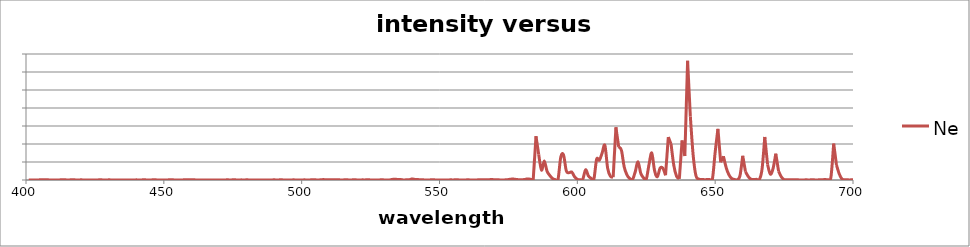
| Category | Ne |
|---|---|
| 401.0 | 1.15 |
| 402.0 | 0 |
| 403.0 | 0 |
| 404.0 | 1.69 |
| 405.0 | 4.13 |
| 406.0 | 9.29 |
| 407.0 | 3.67 |
| 408.0 | 4.07 |
| 409.0 | 1.04 |
| 410.0 | 2.28 |
| 411.0 | 0 |
| 412.0 | 2.03 |
| 413.0 | 7.51 |
| 414.0 | 5.48 |
| 415.0 | 2.01 |
| 416.0 | 3.68 |
| 417.0 | 7.18 |
| 418.0 | 2.76 |
| 419.0 | 0 |
| 420.0 | 5.3 |
| 421.0 | 0 |
| 422.0 | 0 |
| 423.0 | 0.82 |
| 424.0 | 0 |
| 425.0 | 2.9 |
| 426.0 | 2.09 |
| 427.0 | 7.79 |
| 428.0 | 1.15 |
| 429.0 | 0.29 |
| 430.0 | 3.97 |
| 431.0 | 2.51 |
| 432.0 | 1.42 |
| 433.0 | 0 |
| 434.0 | 2.34 |
| 435.0 | 0.03 |
| 436.0 | 0 |
| 437.0 | 0.29 |
| 438.0 | 2.94 |
| 439.0 | 0.92 |
| 440.0 | 3.76 |
| 441.0 | 0.96 |
| 442.0 | 3.11 |
| 443.0 | 5.63 |
| 444.0 | 0.79 |
| 445.0 | 1.07 |
| 446.0 | 4.62 |
| 447.0 | 5.26 |
| 448.0 | 0 |
| 449.0 | 1.96 |
| 450.0 | 2.31 |
| 451.0 | 0.33 |
| 452.0 | 6.99 |
| 453.0 | 8.58 |
| 454.0 | 0 |
| 455.0 | 2.13 |
| 456.0 | 0 |
| 457.0 | 3.47 |
| 458.0 | 7.81 |
| 459.0 | 4.01 |
| 460.0 | 3.73 |
| 461.0 | 5.14 |
| 462.0 | 0 |
| 463.0 | 2.33 |
| 464.0 | 0 |
| 465.0 | 1.23 |
| 466.0 | 0.97 |
| 467.0 | 2.44 |
| 468.0 | 0 |
| 469.0 | 3.19 |
| 470.0 | 0 |
| 471.0 | 3.25 |
| 472.0 | 0 |
| 473.0 | 5.87 |
| 474.0 | 0.76 |
| 475.0 | 4.97 |
| 476.0 | 3.84 |
| 477.0 | 0 |
| 478.0 | 3.71 |
| 479.0 | 0.75 |
| 480.0 | 4.92 |
| 481.0 | 2.19 |
| 482.0 | 0 |
| 483.0 | 2.07 |
| 484.0 | 3.09 |
| 485.0 | 2.38 |
| 486.0 | 1.63 |
| 487.0 | 0 |
| 488.0 | 0 |
| 489.0 | 0 |
| 490.0 | 5.53 |
| 491.0 | 0 |
| 492.0 | 4.21 |
| 493.0 | 3.71 |
| 494.0 | 0.36 |
| 495.0 | 1.97 |
| 496.0 | 0 |
| 497.0 | 4.55 |
| 498.0 | 0.73 |
| 499.0 | 1.6 |
| 500.0 | 1.15 |
| 501.0 | 4.02 |
| 502.0 | 1.36 |
| 503.0 | 3.35 |
| 504.0 | 4.56 |
| 505.0 | 4.94 |
| 506.0 | 0 |
| 507.0 | 7.53 |
| 508.0 | 11.17 |
| 509.0 | 4.76 |
| 510.0 | 4.87 |
| 511.0 | 5.06 |
| 512.0 | 5.67 |
| 513.0 | 8.04 |
| 514.0 | 3.03 |
| 515.0 | 2 |
| 516.0 | 9.31 |
| 517.0 | 2.86 |
| 518.0 | 0.86 |
| 519.0 | 9.83 |
| 520.0 | 2.67 |
| 521.0 | 0 |
| 522.0 | 4.13 |
| 523.0 | 2.64 |
| 524.0 | 10.05 |
| 525.0 | 1.33 |
| 526.0 | 2.02 |
| 527.0 | 1.27 |
| 528.0 | 0.86 |
| 529.0 | 7.26 |
| 530.0 | 2 |
| 531.0 | 1.28 |
| 532.0 | 3.09 |
| 533.0 | 17.91 |
| 534.0 | 20.86 |
| 535.0 | 12.38 |
| 536.0 | 12.14 |
| 537.0 | 1.22 |
| 538.0 | 5.94 |
| 539.0 | 4.72 |
| 540.0 | 29.28 |
| 541.0 | 16.68 |
| 542.0 | 13.47 |
| 543.0 | 5.68 |
| 544.0 | 4.03 |
| 545.0 | 2.45 |
| 546.0 | 0.86 |
| 547.0 | 5.09 |
| 548.0 | 4.78 |
| 549.0 | 0 |
| 550.0 | 0.87 |
| 551.0 | 2.2 |
| 552.0 | 1.96 |
| 553.0 | 0 |
| 554.0 | 4.92 |
| 555.0 | 2.27 |
| 556.0 | 10.15 |
| 557.0 | 3.42 |
| 558.0 | 1.01 |
| 559.0 | 0.22 |
| 560.0 | 4.49 |
| 561.0 | 3.25 |
| 562.0 | 2.55 |
| 563.0 | 1.43 |
| 564.0 | 4.25 |
| 565.0 | 4.64 |
| 566.0 | 5.47 |
| 567.0 | 5.95 |
| 568.0 | 8.72 |
| 569.0 | 14.03 |
| 570.0 | 4.44 |
| 571.0 | 7.54 |
| 572.0 | 2.07 |
| 573.0 | 2.79 |
| 574.0 | 4.24 |
| 575.0 | 12.74 |
| 576.0 | 23.95 |
| 577.0 | 24.56 |
| 578.0 | 13.41 |
| 579.0 | 7.19 |
| 580.0 | 6.87 |
| 581.0 | 16.47 |
| 582.0 | 30.81 |
| 583.0 | 19.2 |
| 584.0 | 1.38 |
| 585.0 | 1216.28 |
| 586.0 | 702.54 |
| 587.0 | 273.48 |
| 588.0 | 527.97 |
| 589.0 | 247.37 |
| 590.0 | 126.45 |
| 591.0 | 42.02 |
| 592.0 | 11.09 |
| 593.0 | 19.9 |
| 594.0 | 642.12 |
| 595.0 | 692.36 |
| 596.0 | 252.77 |
| 597.0 | 204.34 |
| 598.0 | 219.38 |
| 599.0 | 89.82 |
| 600.0 | 20.23 |
| 601.0 | 6.37 |
| 602.0 | 27.27 |
| 603.0 | 284.23 |
| 604.0 | 114.17 |
| 605.0 | 47.45 |
| 606.0 | 24.24 |
| 607.0 | 576.55 |
| 608.0 | 550.76 |
| 609.0 | 752.25 |
| 610.0 | 961.86 |
| 611.0 | 324.27 |
| 612.0 | 102.58 |
| 613.0 | 78.53 |
| 614.0 | 1465.74 |
| 615.0 | 920.81 |
| 616.0 | 823.21 |
| 617.0 | 364.02 |
| 618.0 | 141.47 |
| 619.0 | 40.27 |
| 620.0 | 11.83 |
| 621.0 | 226.5 |
| 622.0 | 507.43 |
| 623.0 | 187.58 |
| 624.0 | 62.25 |
| 625.0 | 21.06 |
| 626.0 | 429.43 |
| 627.0 | 752.02 |
| 628.0 | 267.83 |
| 629.0 | 87.97 |
| 630.0 | 325.47 |
| 631.0 | 330.88 |
| 632.0 | 132.1 |
| 633.0 | 1193.39 |
| 634.0 | 998.94 |
| 635.0 | 404.53 |
| 636.0 | 103.48 |
| 637.0 | 33.49 |
| 638.0 | 1098.91 |
| 639.0 | 665.69 |
| 640.0 | 3312.63 |
| 641.0 | 1758.97 |
| 642.0 | 703.86 |
| 643.0 | 127.06 |
| 644.0 | 27.49 |
| 645.0 | 15.3 |
| 646.0 | 10.01 |
| 647.0 | 10.98 |
| 648.0 | 14.56 |
| 649.0 | 25.04 |
| 650.0 | 772.66 |
| 651.0 | 1421.78 |
| 652.0 | 493 |
| 653.0 | 659.45 |
| 654.0 | 344.19 |
| 655.0 | 143.36 |
| 656.0 | 41.69 |
| 657.0 | 15.96 |
| 658.0 | 7.53 |
| 659.0 | 119.67 |
| 660.0 | 672.75 |
| 661.0 | 231.35 |
| 662.0 | 95.69 |
| 663.0 | 22.52 |
| 664.0 | 12.36 |
| 665.0 | 18.68 |
| 666.0 | 11.05 |
| 667.0 | 298 |
| 668.0 | 1195.76 |
| 669.0 | 433.78 |
| 670.0 | 163.26 |
| 671.0 | 318.61 |
| 672.0 | 731.69 |
| 673.0 | 244.19 |
| 674.0 | 87.41 |
| 675.0 | 10.03 |
| 676.0 | 8.27 |
| 677.0 | 9.21 |
| 678.0 | 8.56 |
| 679.0 | 7.73 |
| 680.0 | 4.04 |
| 681.0 | 2.35 |
| 682.0 | 0 |
| 683.0 | 6.19 |
| 684.0 | 0 |
| 685.0 | 8.86 |
| 686.0 | 4.11 |
| 687.0 | 1.11 |
| 688.0 | 10.14 |
| 689.0 | 8.9 |
| 690.0 | 13.02 |
| 691.0 | 7 |
| 692.0 | 82.33 |
| 693.0 | 1012.03 |
| 694.0 | 417.32 |
| 695.0 | 171.54 |
| 696.0 | 27.2 |
| 697.0 | 9.31 |
| 698.0 | 4.83 |
| 699.0 | 3.25 |
| 700.0 | 10.31 |